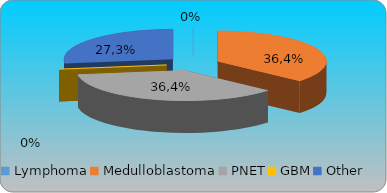
| Category | Series 0 | Series 1 | Series 2 | Series 3 |
|---|---|---|---|---|
| Lymphoma | 0 |  |  |  |
| Medulloblastoma | 0.364 |  |  |  |
| PNET | 0.364 |  |  |  |
| GBM | 0 |  |  |  |
| Other | 0.273 |  |  |  |